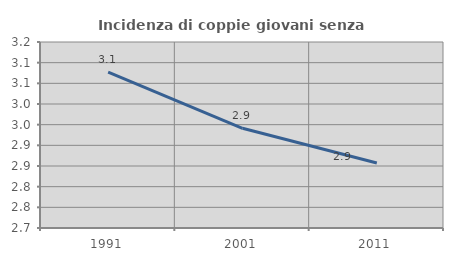
| Category | Incidenza di coppie giovani senza figli |
|---|---|
| 1991.0 | 3.077 |
| 2001.0 | 2.941 |
| 2011.0 | 2.857 |